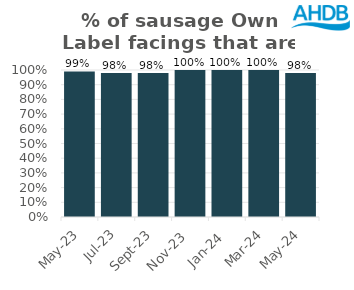
| Category | Sausage |
|---|---|
| 2023-05-01 | 0.99 |
| 2023-07-01 | 0.98 |
| 2023-09-01 | 0.98 |
| 2023-11-01 | 1 |
| 2024-01-01 | 1 |
| 2024-03-01 | 1 |
| 2024-05-01 | 0.98 |